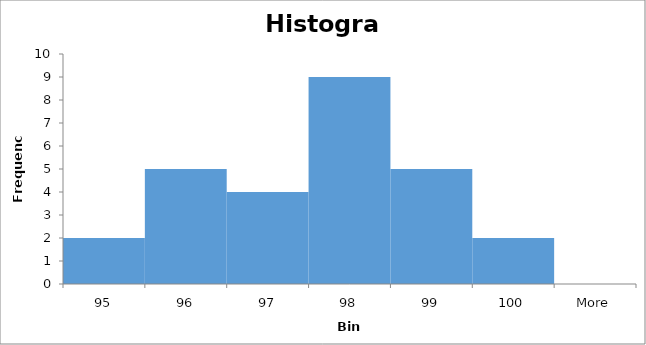
| Category | Frequency |
|---|---|
| 95 | 2 |
| 96 | 5 |
| 97 | 4 |
| 98 | 9 |
| 99 | 5 |
| 100 | 2 |
| More | 0 |